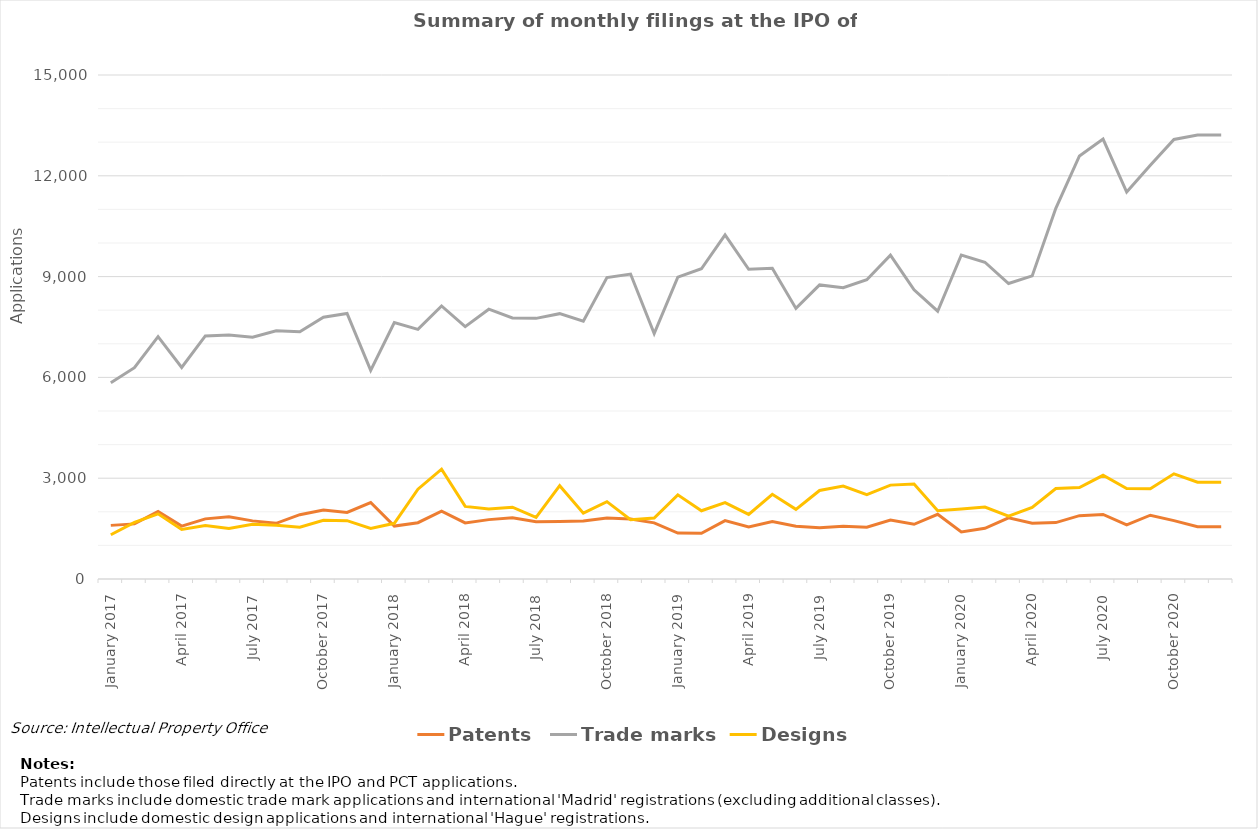
| Category | Patents | Trade marks | Designs |
|---|---|---|---|
| January 2017 | 1596 | 5843 | 1318 |
| February 2017 | 1640 | 6288 | 1687 |
| March 2017 | 2011 | 7214 | 1940 |
| April 2017 | 1573 | 6297 | 1474 |
| May 2017 | 1790 | 7234 | 1592 |
| June 2017 | 1853 | 7263 | 1502 |
| July 2017 | 1730 | 7197 | 1627 |
| August 2017 | 1657 | 7389 | 1600 |
| September 2017 | 1915 | 7359 | 1544 |
| October 2017 | 2055 | 7792 | 1745 |
| November 2017 | 1983 | 7901 | 1736 |
| December 2017 | 2277 | 6211 | 1507 |
| January 2018 | 1575 | 7634 | 1658 |
| February 2018 | 1676 | 7428 | 2672 |
| March 2018 | 2022 | 8127 | 3267 |
| April 2018 | 1670 | 7512 | 2160 |
| May 2018 | 1767 | 8030 | 2083 |
| June 2018 | 1821 | 7769 | 2136 |
| July 2018 | 1704 | 7757 | 1832 |
| August 2018 | 1713 | 7897 | 2777 |
| September 2018 | 1725 | 7673 | 1960 |
| October 2018 | 1818 | 8972 | 2302 |
| November 2018 | 1787 | 9076 | 1765 |
| December 2018 | 1670 | 7304 | 1815 |
| January 2019 | 1367 | 8983 | 2505 |
| February 2019 | 1361 | 9234 | 2031 |
| March 2019 | 1737 | 10244 | 2275 |
| April 2019 | 1552 | 9219 | 1923 |
| May 2019 | 1710 | 9251 | 2520 |
| June 2019 | 1570 | 8053 | 2074 |
| July 2019 | 1527 | 8752 | 2634 |
| August 2019 | 1572 | 8670 | 2768 |
| September 2019 | 1540 | 8907 | 2511 |
| October 2019 | 1755 | 9636 | 2794 |
| November 2019 | 1629 | 8607 | 2827 |
| December 2019 | 1927 | 7970 | 2034 |
| January 2020 | 1400 | 9642 | 2082 |
| February 2020 | 1509 | 9428 | 2143 |
| March 2020 | 1820 | 8794 | 1871 |
| April 2020 | 1658 | 9021 | 2127 |
| May 2020 | 1678 | 11034 | 2694 |
| June 2020 | 1886 | 12590 | 2721 |
| July 2020 | 1921 | 13092 | 3086 |
| August 2020 | 1614 | 11515 | 2695 |
| September 2020 | 1898 | 12311 | 2685 |
| October 2020 | 1738 | 13081 | 3130 |
| November 2020 | 1553 | 13214 | 2882 |
| November 2020 | 1553 | 13214 | 2882 |